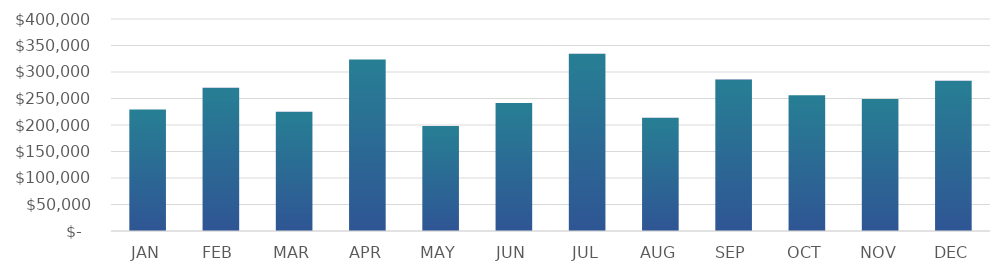
| Category | REVENUE |
|---|---|
|  JAN  | 229254 |
|  FEB  | 270209 |
|  MAR  | 225209 |
|  APR  | 323746 |
|  MAY  | 198227 |
|  JUN  | 241498 |
|  JUL  | 334224 |
|  AUG  | 213800 |
|  SEP  | 285710 |
|  OCT  | 256104 |
|  NOV  | 248840 |
|  DEC  | 283700 |